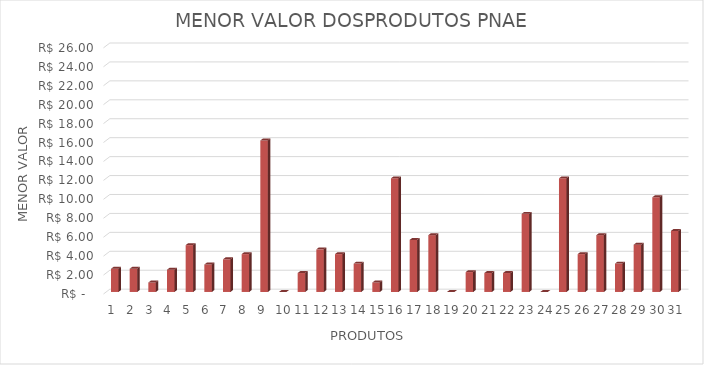
| Category | Series 0 |
|---|---|
| 0 | 2.45 |
| 1 | 2.45 |
| 2 | 1 |
| 3 | 2.35 |
| 4 | 4.95 |
| 5 | 2.9 |
| 6 | 3.45 |
| 7 | 4 |
| 8 | 16 |
| 9 | 0 |
| 10 | 2 |
| 11 | 4.5 |
| 12 | 4 |
| 13 | 3 |
| 14 | 1 |
| 15 | 12 |
| 16 | 5.5 |
| 17 | 6 |
| 18 | 0 |
| 19 | 2.1 |
| 20 | 2 |
| 21 | 2 |
| 22 | 8.25 |
| 23 | 0 |
| 24 | 12 |
| 25 | 4 |
| 26 | 6 |
| 27 | 3 |
| 28 | 4.99 |
| 29 | 10 |
| 30 | 6.45 |